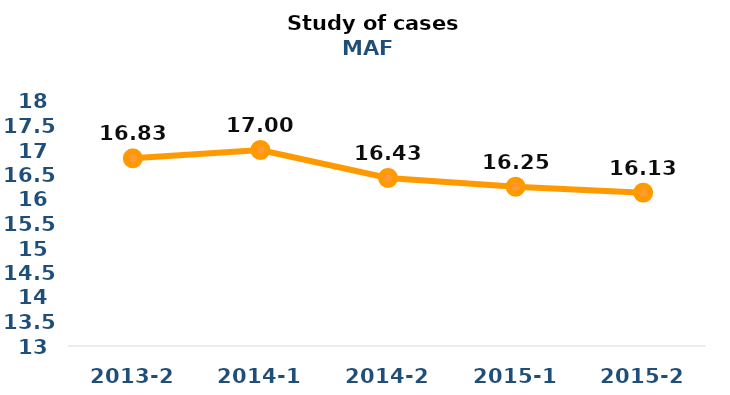
| Category | Series 0 |
|---|---|
| 2013-2 | 16.83 |
| 2014-1 | 17 |
| 2014-2 | 16.43 |
| 2015-1 | 16.25 |
| 2015-2 | 16.13 |